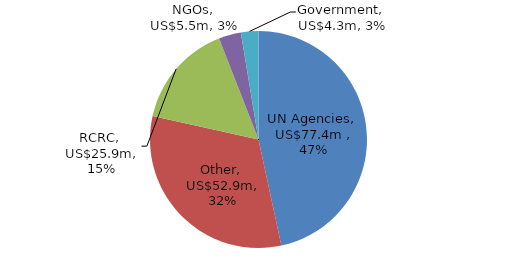
| Category | US$ millions |
|---|---|
| UN Agencies | 77.417 |
| Other | 52.91 |
| RCRC | 25.903 |
| NGOs | 5.506 |
| Government | 4.327 |